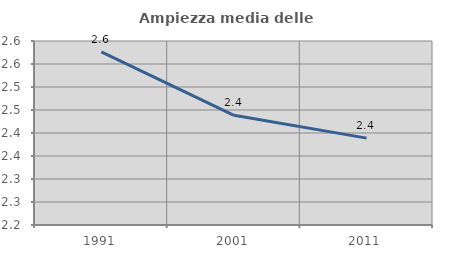
| Category | Ampiezza media delle famiglie |
|---|---|
| 1991.0 | 2.576 |
| 2001.0 | 2.438 |
| 2011.0 | 2.389 |